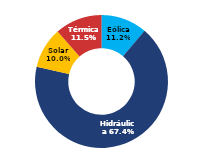
| Category | Sur |
|---|---|
| Eólica | 70.221 |
| Hidráulica | 421.795 |
| Solar | 62.391 |
| Térmica | 71.788 |